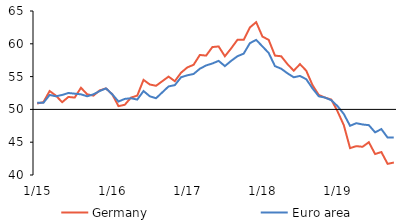
| Category | Germany | Euro area |
|---|---|---|
|  1/15 | 50.9 | 51 |
| 2 | 51.1 | 51 |
| 3 | 52.8 | 52.2 |
| 4 | 52.1 | 52 |
| 5 | 51.1 | 52.2 |
| 6 | 51.9 | 52.5 |
| 7 | 51.8 | 52.4 |
| 8 | 53.3 | 52.3 |
| 9 | 52.3 | 52 |
| 10 | 52.1 | 52.3 |
| 11 | 52.9 | 52.8 |
| 12 | 53.2 | 53.2 |
|  1/16 | 52.3 | 52.3 |
| 2 | 50.5 | 51.2 |
| 3 | 50.7 | 51.6 |
| 4 | 51.8 | 51.7 |
| 5 | 52.1 | 51.5 |
| 6 | 54.5 | 52.8 |
| 7 | 53.8 | 52 |
| 8 | 53.6 | 51.7 |
| 9 | 54.3 | 52.6 |
| 10 | 55 | 53.5 |
| 11 | 54.3 | 53.7 |
| 12 | 55.6 | 54.9 |
|  1/17 | 56.4 | 55.2 |
| 2 | 56.8 | 55.4 |
| 3 | 58.3 | 56.2 |
| 4 | 58.2 | 56.7 |
| 5 | 59.5 | 57 |
| 6 | 59.6 | 57.4 |
| 7 | 58.1 | 56.6 |
| 8 | 59.3 | 57.4 |
| 9 | 60.6 | 58.1 |
| 10 | 60.6 | 58.5 |
| 11 | 62.5 | 60.1 |
| 12 | 63.3 | 60.6 |
|  1/18 | 61.1 | 59.6 |
| 2 | 60.6 | 58.6 |
| 3 | 58.2 | 56.6 |
| 4 | 58.1 | 56.2 |
| 5 | 56.9 | 55.5 |
| 6 | 55.9 | 54.9 |
| 7 | 56.9 | 55.1 |
| 8 | 55.9 | 54.6 |
| 9 | 53.7 | 53.2 |
| 10 | 52.2 | 52 |
| 11 | 51.8 | 51.8 |
| 12 | 51.5 | 51.4 |
|  1/19 | 49.7 | 50.5 |
| 2 | 47.6 | 49.3 |
| 3 | 44.1 | 47.5 |
| 4 | 44.4 | 47.9 |
| 5 | 44.3 | 47.7 |
| 6 | 45 | 47.6 |
| 7 | 43.2 | 46.5 |
| 8 | 43.5 | 47 |
| 9 | 41.7 | 45.7 |
| 10 | 41.9 | 45.7 |